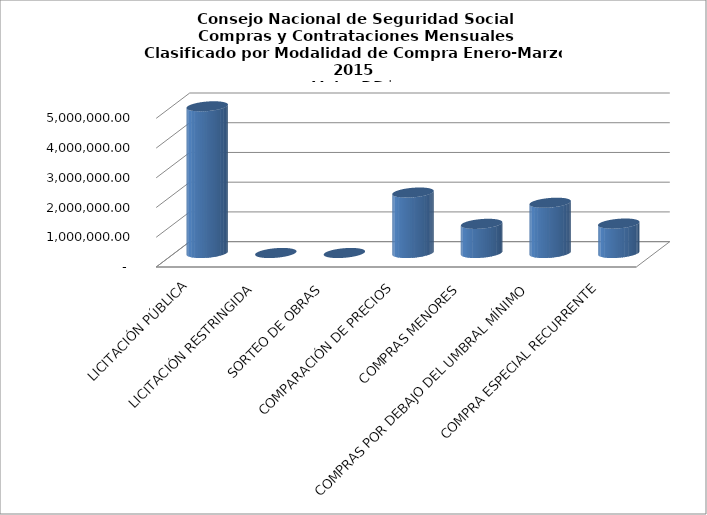
| Category | Series 0 |
|---|---|
| LICITACIÓN PÚBLICA | 4934331.28 |
| LICITACIÓN RESTRINGIDA | 0 |
| SORTEO DE OBRAS | 0 |
| COMPARACIÓN DE PRECIOS | 2033286.13 |
| COMPRAS MENORES | 980966.76 |
| COMPRAS POR DEBAJO DEL UMBRAL MÍNIMO | 1690524.3 |
| COMPRA ESPECIAL RECURRENTE | 990000 |